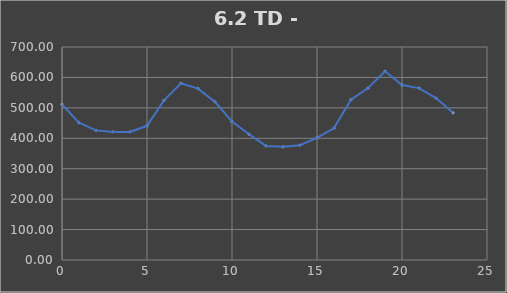
| Category | TOTAL |
|---|---|
| 0.0 | 511.264 |
| 1.0 | 451.014 |
| 2.0 | 426.004 |
| 3.0 | 421.034 |
| 4.0 | 421.034 |
| 5.0 | 441.004 |
| 6.0 | 524.764 |
| 7.0 | 580.454 |
| 8.0 | 563.139 |
| 9.0 | 519.756 |
| 10.0 | 454.816 |
| 11.0 | 413.336 |
| 12.0 | 374.926 |
| 13.0 | 371.956 |
| 14.0 | 377.359 |
| 15.0 | 401.509 |
| 16.0 | 433.469 |
| 17.0 | 526.799 |
| 18.0 | 564.946 |
| 19.0 | 620.216 |
| 20.0 | 575.216 |
| 21.0 | 564.946 |
| 22.0 | 532.139 |
| 23.0 | 483.819 |